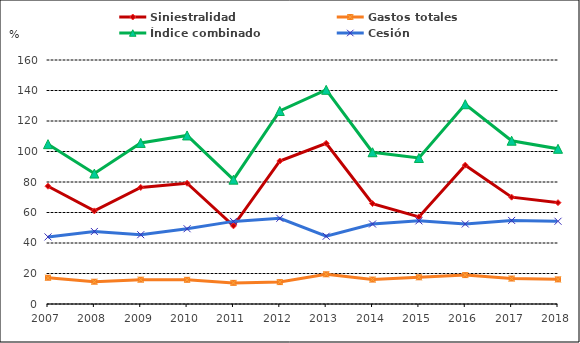
| Category | Siniestralidad | Gastos totales | Índice combinado | Cesión |
|---|---|---|---|---|
| 2007 | 77.23 | 17.2 | 104.82 | 43.98 |
| 2008 | 61.05 | 14.61 | 85.53 | 47.56 |
| 2009 | 76.41 | 15.94 | 105.63 | 45.44 |
| 2010 | 79.18 | 15.85 | 110.53 | 49.36 |
| 2011 | 51.27 | 13.85 | 81.53 | 54.17 |
| 2012 | 93.77 | 14.37 | 126.57 | 56.2 |
| 2013 | 105.36 | 19.5 | 140.45 | 44.43 |
| 2014 | 65.84 | 16.01 | 99.51 | 52.44 |
| 2015 | 57.13 | 17.52 | 95.75 | 54.51 |
| 2016 | 91.045 | 18.97 | 131 | 52.467 |
| 2017 | 70.07 | 16.688 | 107.07 | 54.803 |
| 2018 | 66.435 | 16.14 | 101.775 | 54.259 |